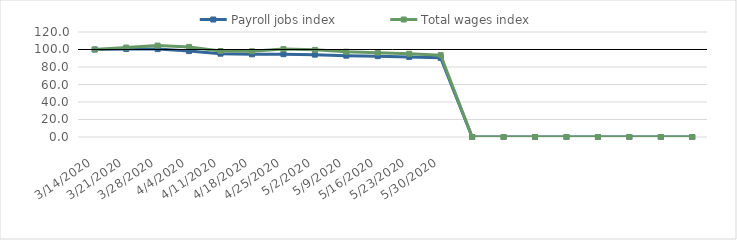
| Category | Payroll jobs index | Total wages index |
|---|---|---|
| 14/03/2020 | 100 | 100 |
| 21/03/2020 | 100.639 | 102.22 |
| 28/03/2020 | 100.433 | 104.466 |
| 04/04/2020 | 98.168 | 102.976 |
| 11/04/2020 | 95.218 | 98.281 |
| 18/04/2020 | 94.55 | 97.953 |
| 25/04/2020 | 94.673 | 100.452 |
| 02/05/2020 | 94.13 | 99.583 |
| 09/05/2020 | 92.935 | 97.464 |
| 16/05/2020 | 92.378 | 96.394 |
| 23/05/2020 | 91.481 | 95.137 |
| 30/05/2020 | 90.469 | 93.565 |